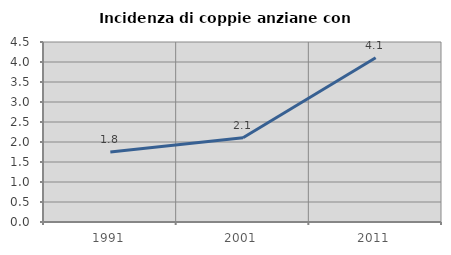
| Category | Incidenza di coppie anziane con figli |
|---|---|
| 1991.0 | 1.751 |
| 2001.0 | 2.107 |
| 2011.0 | 4.107 |